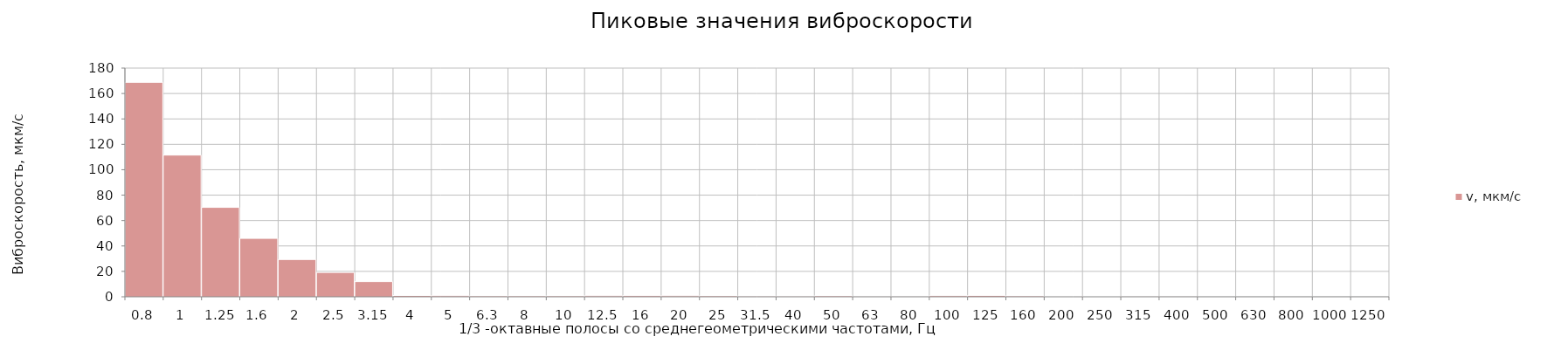
| Category | v, мкм/c |
|---|---|
| 0.8 | 168.796 |
| 1.0 | 111.519 |
| 1.25 | 70.365 |
| 1.6 | 45.956 |
| 2.0 | 29.332 |
| 2.5 | 19.158 |
| 3.15 | 11.949 |
| 4.0 | 1.041 |
| 5.0 | 0.817 |
| 6.3 | 0.688 |
| 8.0 | 0.696 |
| 10.0 | 0.704 |
| 12.5 | 0.789 |
| 16.0 | 0.917 |
| 20.0 | 0.78 |
| 25.0 | 0.772 |
| 31.5 | 0.546 |
| 40.0 | 0.492 |
| 50.0 | 0.737 |
| 63.0 | 0.163 |
| 80.0 | 0.15 |
| 100.0 | 0.876 |
| 125.0 | 1.09 |
| 160.0 | 0.68 |
| 200.0 | 0.365 |
| 250.0 | 0.361 |
| 315.0 | 0.15 |
| 400.0 | 0.097 |
| 500.0 | 0.08 |
| 630.0 | 0.07 |
| 800.0 | 0.054 |
| 1000.0 | 0.043 |
| 1250.0 | 0.036 |